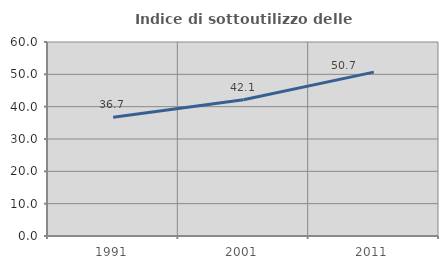
| Category | Indice di sottoutilizzo delle abitazioni  |
|---|---|
| 1991.0 | 36.743 |
| 2001.0 | 42.129 |
| 2011.0 | 50.688 |